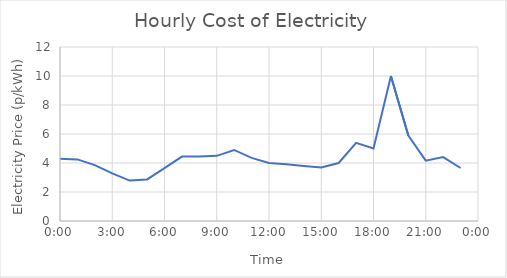
| Category | Series 0 |
|---|---|
| 0.0 | 4.286 |
| 0.041666666666666664 | 4.248 |
| 0.0833333333333333 | 3.851 |
| 0.125 | 3.289 |
| 0.166666666666667 | 2.789 |
| 0.208333333333333 | 2.866 |
| 0.25 | 3.643 |
| 0.291666666666667 | 4.44 |
| 0.333333333333333 | 4.45 |
| 0.375 | 4.492 |
| 0.416666666666667 | 4.9 |
| 0.458333333333333 | 4.351 |
| 0.5 | 4 |
| 0.541666666666667 | 3.917 |
| 0.583333333333333 | 3.798 |
| 0.625 | 3.692 |
| 0.666666666666667 | 4 |
| 0.708333333333333 | 5.394 |
| 0.75 | 5 |
| 0.791666666666667 | 10 |
| 0.833333333333333 | 5.9 |
| 0.875 | 4.16 |
| 0.916666666666667 | 4.408 |
| 0.958333333333333 | 3.657 |